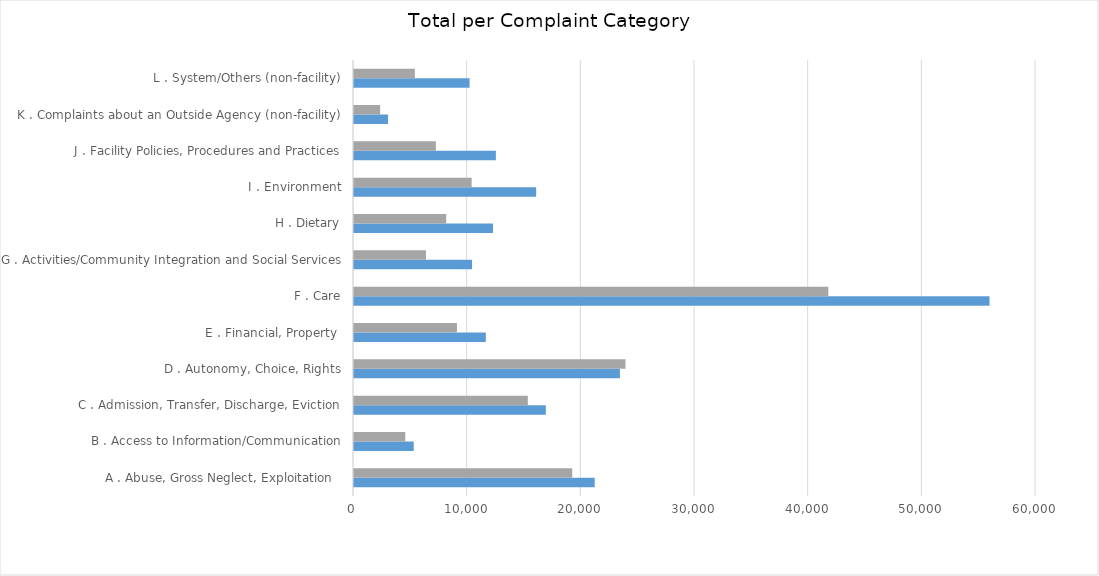
| Category | Total per complainant  category FFY 2019 | Total per complainant  category FFY 2020 |
|---|---|---|
| A . Abuse, Gross Neglect, Exploitation   | 21177 | 19201 |
| B . Access to Information/Communication | 5255 | 4513 |
| C . Admission, Transfer, Discharge, Eviction | 16875 | 15292 |
| D . Autonomy, Choice, Rights | 23396 | 23881 |
| E . Financial, Property  | 11597 | 9057 |
| F . Care | 55910 | 41731 |
| G . Activities/Community Integration and Social Services | 10386 | 6332 |
| H . Dietary | 12231 | 8111 |
| I . Environment | 16028 | 10350 |
| J . Facility Policies, Procedures and Practices | 12482 | 7205 |
| K . Complaints about an Outside Agency (non-facility) | 2997 | 2299 |
| L . System/Others (non-facility) | 10168 | 5352 |